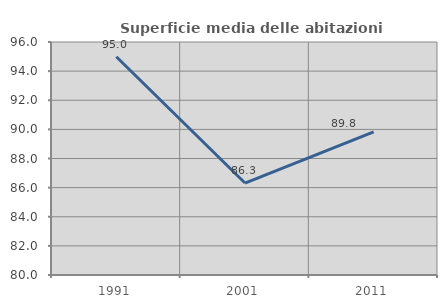
| Category | Superficie media delle abitazioni occupate |
|---|---|
| 1991.0 | 94.984 |
| 2001.0 | 86.316 |
| 2011.0 | 89.833 |